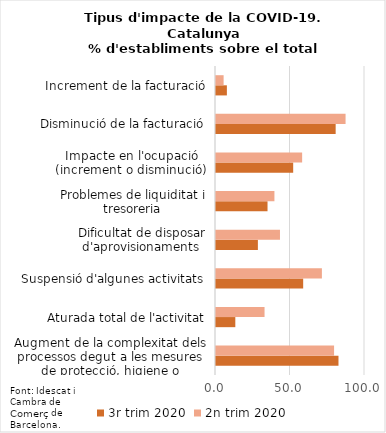
| Category | 3r trim 2020 | 2n trim 2020 |
|---|---|---|
| Augment de la complexitat dels processos degut a les mesures de protecció, higiene o prevenció | 82.201 | 79.243 |
| Aturada total de l'activitat | 12.964 | 32.577 |
| Suspensió d'algunes activitats | 58.507 | 71.073 |
| Dificultat de disposar d'aprovisionaments | 28.11 | 42.938 |
| Problemes de liquiditat i tresoreria | 34.579 | 39.21 |
| Impacte en l'ocupació (increment o disminució) | 51.802 | 57.812 |
| Disminució de la facturació | 80.307 | 86.959 |
| Increment de la facturació | 7.3 | 5.108 |